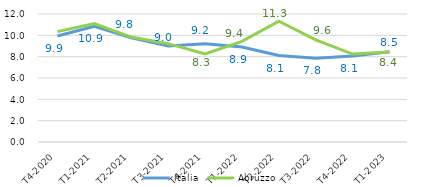
| Category | Italia | Abruzzo |
|---|---|---|
|   T4-2020 | 9.94 | 10.345 |
|   T1-2021 | 10.854 | 11.098 |
|   T2-2021 | 9.774 | 9.837 |
|   T3-2021 | 9.006 | 9.219 |
|   T4-2021 | 9.222 | 8.254 |
|   T1-2022 | 8.898 | 9.43 |
|   T2-2022 | 8.105 | 11.322 |
|   T3-2022 | 7.843 | 9.583 |
|   T4-2022 | 8.065 | 8.244 |
|   T1-2023 | 8.454 | 8.433 |